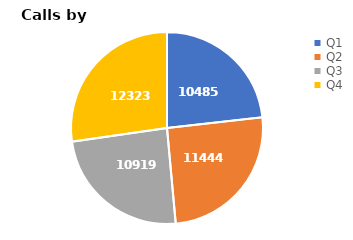
| Category | Quarter |
|---|---|
| Q1 | 10485 |
| Q2 | 11444 |
| Q3 | 10919 |
| Q4 | 12323 |